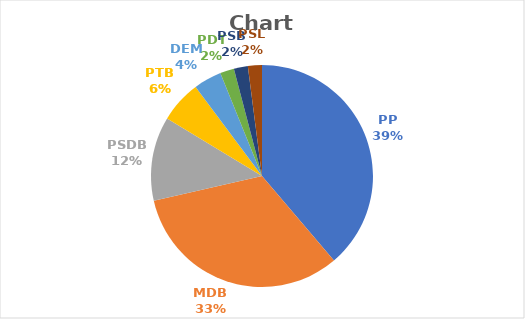
| Category | Series 0 |
|---|---|
| PP | 19 |
| MDB | 16 |
| PSDB | 6 |
| PTB | 3 |
| DEM | 2 |
| PDT | 1 |
| PSB | 1 |
| PSL | 1 |